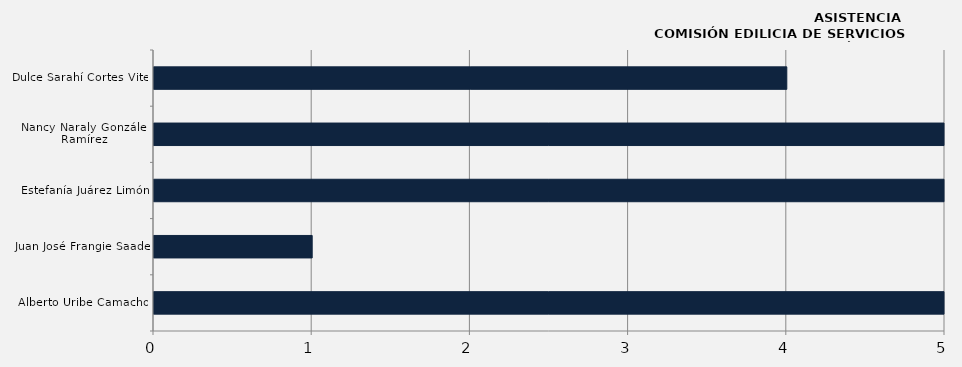
| Category | Alberto Uribe Camacho |
|---|---|
| Alberto Uribe Camacho | 6 |
| Juan José Frangie Saade | 1 |
| Estefanía Juárez Limón | 6 |
| Nancy Naraly González Ramírez | 6 |
| Dulce Sarahí Cortes Vite | 4 |